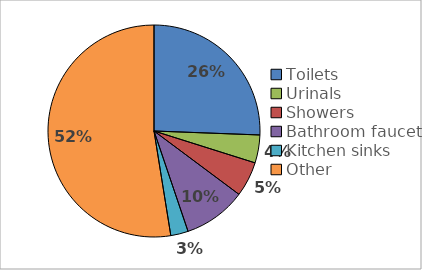
| Category | Series 0 |
|---|---|
| Toilets | 163.8 |
| Urinals | 27.3 |
| Showers | 34.125 |
| Bathroom faucets | 61.425 |
| Kitchen sinks | 17.062 |
| Other | 336.2 |